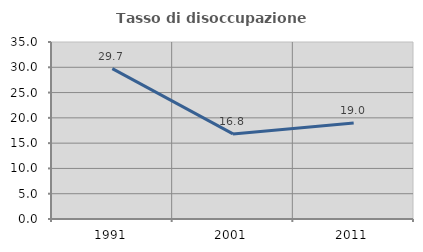
| Category | Tasso di disoccupazione giovanile  |
|---|---|
| 1991.0 | 29.748 |
| 2001.0 | 16.823 |
| 2011.0 | 19.002 |